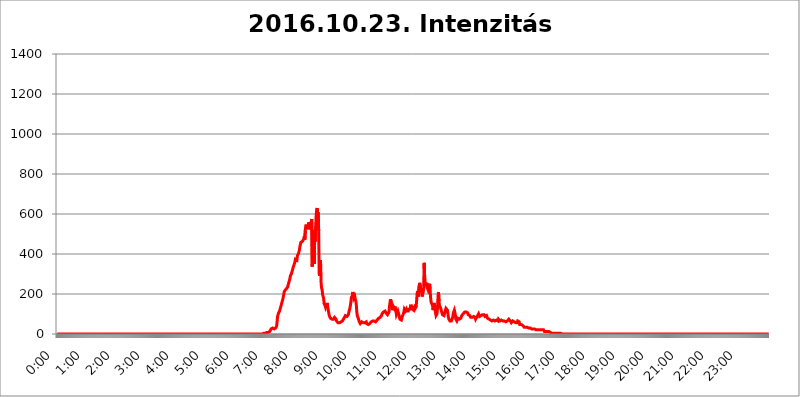
| Category | 2016.10.23. Intenzitás [W/m^2] |
|---|---|
| 0.0 | 0 |
| 0.0006944444444444445 | 0 |
| 0.001388888888888889 | 0 |
| 0.0020833333333333333 | 0 |
| 0.002777777777777778 | 0 |
| 0.003472222222222222 | 0 |
| 0.004166666666666667 | 0 |
| 0.004861111111111111 | 0 |
| 0.005555555555555556 | 0 |
| 0.0062499999999999995 | 0 |
| 0.006944444444444444 | 0 |
| 0.007638888888888889 | 0 |
| 0.008333333333333333 | 0 |
| 0.009027777777777779 | 0 |
| 0.009722222222222222 | 0 |
| 0.010416666666666666 | 0 |
| 0.011111111111111112 | 0 |
| 0.011805555555555555 | 0 |
| 0.012499999999999999 | 0 |
| 0.013194444444444444 | 0 |
| 0.013888888888888888 | 0 |
| 0.014583333333333332 | 0 |
| 0.015277777777777777 | 0 |
| 0.015972222222222224 | 0 |
| 0.016666666666666666 | 0 |
| 0.017361111111111112 | 0 |
| 0.018055555555555557 | 0 |
| 0.01875 | 0 |
| 0.019444444444444445 | 0 |
| 0.02013888888888889 | 0 |
| 0.020833333333333332 | 0 |
| 0.02152777777777778 | 0 |
| 0.022222222222222223 | 0 |
| 0.02291666666666667 | 0 |
| 0.02361111111111111 | 0 |
| 0.024305555555555556 | 0 |
| 0.024999999999999998 | 0 |
| 0.025694444444444447 | 0 |
| 0.02638888888888889 | 0 |
| 0.027083333333333334 | 0 |
| 0.027777777777777776 | 0 |
| 0.02847222222222222 | 0 |
| 0.029166666666666664 | 0 |
| 0.029861111111111113 | 0 |
| 0.030555555555555555 | 0 |
| 0.03125 | 0 |
| 0.03194444444444445 | 0 |
| 0.03263888888888889 | 0 |
| 0.03333333333333333 | 0 |
| 0.034027777777777775 | 0 |
| 0.034722222222222224 | 0 |
| 0.035416666666666666 | 0 |
| 0.036111111111111115 | 0 |
| 0.03680555555555556 | 0 |
| 0.0375 | 0 |
| 0.03819444444444444 | 0 |
| 0.03888888888888889 | 0 |
| 0.03958333333333333 | 0 |
| 0.04027777777777778 | 0 |
| 0.04097222222222222 | 0 |
| 0.041666666666666664 | 0 |
| 0.042361111111111106 | 0 |
| 0.04305555555555556 | 0 |
| 0.043750000000000004 | 0 |
| 0.044444444444444446 | 0 |
| 0.04513888888888889 | 0 |
| 0.04583333333333334 | 0 |
| 0.04652777777777778 | 0 |
| 0.04722222222222222 | 0 |
| 0.04791666666666666 | 0 |
| 0.04861111111111111 | 0 |
| 0.049305555555555554 | 0 |
| 0.049999999999999996 | 0 |
| 0.05069444444444445 | 0 |
| 0.051388888888888894 | 0 |
| 0.052083333333333336 | 0 |
| 0.05277777777777778 | 0 |
| 0.05347222222222222 | 0 |
| 0.05416666666666667 | 0 |
| 0.05486111111111111 | 0 |
| 0.05555555555555555 | 0 |
| 0.05625 | 0 |
| 0.05694444444444444 | 0 |
| 0.057638888888888885 | 0 |
| 0.05833333333333333 | 0 |
| 0.05902777777777778 | 0 |
| 0.059722222222222225 | 0 |
| 0.06041666666666667 | 0 |
| 0.061111111111111116 | 0 |
| 0.06180555555555556 | 0 |
| 0.0625 | 0 |
| 0.06319444444444444 | 0 |
| 0.06388888888888888 | 0 |
| 0.06458333333333334 | 0 |
| 0.06527777777777778 | 0 |
| 0.06597222222222222 | 0 |
| 0.06666666666666667 | 0 |
| 0.06736111111111111 | 0 |
| 0.06805555555555555 | 0 |
| 0.06874999999999999 | 0 |
| 0.06944444444444443 | 0 |
| 0.07013888888888889 | 0 |
| 0.07083333333333333 | 0 |
| 0.07152777777777779 | 0 |
| 0.07222222222222223 | 0 |
| 0.07291666666666667 | 0 |
| 0.07361111111111111 | 0 |
| 0.07430555555555556 | 0 |
| 0.075 | 0 |
| 0.07569444444444444 | 0 |
| 0.0763888888888889 | 0 |
| 0.07708333333333334 | 0 |
| 0.07777777777777778 | 0 |
| 0.07847222222222222 | 0 |
| 0.07916666666666666 | 0 |
| 0.0798611111111111 | 0 |
| 0.08055555555555556 | 0 |
| 0.08125 | 0 |
| 0.08194444444444444 | 0 |
| 0.08263888888888889 | 0 |
| 0.08333333333333333 | 0 |
| 0.08402777777777777 | 0 |
| 0.08472222222222221 | 0 |
| 0.08541666666666665 | 0 |
| 0.08611111111111112 | 0 |
| 0.08680555555555557 | 0 |
| 0.08750000000000001 | 0 |
| 0.08819444444444445 | 0 |
| 0.08888888888888889 | 0 |
| 0.08958333333333333 | 0 |
| 0.09027777777777778 | 0 |
| 0.09097222222222222 | 0 |
| 0.09166666666666667 | 0 |
| 0.09236111111111112 | 0 |
| 0.09305555555555556 | 0 |
| 0.09375 | 0 |
| 0.09444444444444444 | 0 |
| 0.09513888888888888 | 0 |
| 0.09583333333333333 | 0 |
| 0.09652777777777777 | 0 |
| 0.09722222222222222 | 0 |
| 0.09791666666666667 | 0 |
| 0.09861111111111111 | 0 |
| 0.09930555555555555 | 0 |
| 0.09999999999999999 | 0 |
| 0.10069444444444443 | 0 |
| 0.1013888888888889 | 0 |
| 0.10208333333333335 | 0 |
| 0.10277777777777779 | 0 |
| 0.10347222222222223 | 0 |
| 0.10416666666666667 | 0 |
| 0.10486111111111111 | 0 |
| 0.10555555555555556 | 0 |
| 0.10625 | 0 |
| 0.10694444444444444 | 0 |
| 0.1076388888888889 | 0 |
| 0.10833333333333334 | 0 |
| 0.10902777777777778 | 0 |
| 0.10972222222222222 | 0 |
| 0.1111111111111111 | 0 |
| 0.11180555555555556 | 0 |
| 0.11180555555555556 | 0 |
| 0.1125 | 0 |
| 0.11319444444444444 | 0 |
| 0.11388888888888889 | 0 |
| 0.11458333333333333 | 0 |
| 0.11527777777777777 | 0 |
| 0.11597222222222221 | 0 |
| 0.11666666666666665 | 0 |
| 0.1173611111111111 | 0 |
| 0.11805555555555557 | 0 |
| 0.11944444444444445 | 0 |
| 0.12013888888888889 | 0 |
| 0.12083333333333333 | 0 |
| 0.12152777777777778 | 0 |
| 0.12222222222222223 | 0 |
| 0.12291666666666667 | 0 |
| 0.12291666666666667 | 0 |
| 0.12361111111111112 | 0 |
| 0.12430555555555556 | 0 |
| 0.125 | 0 |
| 0.12569444444444444 | 0 |
| 0.12638888888888888 | 0 |
| 0.12708333333333333 | 0 |
| 0.16875 | 0 |
| 0.12847222222222224 | 0 |
| 0.12916666666666668 | 0 |
| 0.12986111111111112 | 0 |
| 0.13055555555555556 | 0 |
| 0.13125 | 0 |
| 0.13194444444444445 | 0 |
| 0.1326388888888889 | 0 |
| 0.13333333333333333 | 0 |
| 0.13402777777777777 | 0 |
| 0.13402777777777777 | 0 |
| 0.13472222222222222 | 0 |
| 0.13541666666666666 | 0 |
| 0.1361111111111111 | 0 |
| 0.13749999999999998 | 0 |
| 0.13819444444444443 | 0 |
| 0.1388888888888889 | 0 |
| 0.13958333333333334 | 0 |
| 0.14027777777777778 | 0 |
| 0.14097222222222222 | 0 |
| 0.14166666666666666 | 0 |
| 0.1423611111111111 | 0 |
| 0.14305555555555557 | 0 |
| 0.14375000000000002 | 0 |
| 0.14444444444444446 | 0 |
| 0.1451388888888889 | 0 |
| 0.1451388888888889 | 0 |
| 0.14652777777777778 | 0 |
| 0.14722222222222223 | 0 |
| 0.14791666666666667 | 0 |
| 0.1486111111111111 | 0 |
| 0.14930555555555555 | 0 |
| 0.15 | 0 |
| 0.15069444444444444 | 0 |
| 0.15138888888888888 | 0 |
| 0.15208333333333332 | 0 |
| 0.15277777777777776 | 0 |
| 0.15347222222222223 | 0 |
| 0.15416666666666667 | 0 |
| 0.15486111111111112 | 0 |
| 0.15555555555555556 | 0 |
| 0.15625 | 0 |
| 0.15694444444444444 | 0 |
| 0.15763888888888888 | 0 |
| 0.15833333333333333 | 0 |
| 0.15902777777777777 | 0 |
| 0.15972222222222224 | 0 |
| 0.16041666666666668 | 0 |
| 0.16111111111111112 | 0 |
| 0.16180555555555556 | 0 |
| 0.1625 | 0 |
| 0.16319444444444445 | 0 |
| 0.1638888888888889 | 0 |
| 0.16458333333333333 | 0 |
| 0.16527777777777777 | 0 |
| 0.16597222222222222 | 0 |
| 0.16666666666666666 | 0 |
| 0.1673611111111111 | 0 |
| 0.16805555555555554 | 0 |
| 0.16874999999999998 | 0 |
| 0.16944444444444443 | 0 |
| 0.17013888888888887 | 0 |
| 0.1708333333333333 | 0 |
| 0.17152777777777775 | 0 |
| 0.17222222222222225 | 0 |
| 0.1729166666666667 | 0 |
| 0.17361111111111113 | 0 |
| 0.17430555555555557 | 0 |
| 0.17500000000000002 | 0 |
| 0.17569444444444446 | 0 |
| 0.1763888888888889 | 0 |
| 0.17708333333333334 | 0 |
| 0.17777777777777778 | 0 |
| 0.17847222222222223 | 0 |
| 0.17916666666666667 | 0 |
| 0.1798611111111111 | 0 |
| 0.18055555555555555 | 0 |
| 0.18125 | 0 |
| 0.18194444444444444 | 0 |
| 0.1826388888888889 | 0 |
| 0.18333333333333335 | 0 |
| 0.1840277777777778 | 0 |
| 0.18472222222222223 | 0 |
| 0.18541666666666667 | 0 |
| 0.18611111111111112 | 0 |
| 0.18680555555555556 | 0 |
| 0.1875 | 0 |
| 0.18819444444444444 | 0 |
| 0.18888888888888888 | 0 |
| 0.18958333333333333 | 0 |
| 0.19027777777777777 | 0 |
| 0.1909722222222222 | 0 |
| 0.19166666666666665 | 0 |
| 0.19236111111111112 | 0 |
| 0.19305555555555554 | 0 |
| 0.19375 | 0 |
| 0.19444444444444445 | 0 |
| 0.1951388888888889 | 0 |
| 0.19583333333333333 | 0 |
| 0.19652777777777777 | 0 |
| 0.19722222222222222 | 0 |
| 0.19791666666666666 | 0 |
| 0.1986111111111111 | 0 |
| 0.19930555555555554 | 0 |
| 0.19999999999999998 | 0 |
| 0.20069444444444443 | 0 |
| 0.20138888888888887 | 0 |
| 0.2020833333333333 | 0 |
| 0.2027777777777778 | 0 |
| 0.2034722222222222 | 0 |
| 0.2041666666666667 | 0 |
| 0.20486111111111113 | 0 |
| 0.20555555555555557 | 0 |
| 0.20625000000000002 | 0 |
| 0.20694444444444446 | 0 |
| 0.2076388888888889 | 0 |
| 0.20833333333333334 | 0 |
| 0.20902777777777778 | 0 |
| 0.20972222222222223 | 0 |
| 0.21041666666666667 | 0 |
| 0.2111111111111111 | 0 |
| 0.21180555555555555 | 0 |
| 0.2125 | 0 |
| 0.21319444444444444 | 0 |
| 0.2138888888888889 | 0 |
| 0.21458333333333335 | 0 |
| 0.2152777777777778 | 0 |
| 0.21597222222222223 | 0 |
| 0.21666666666666667 | 0 |
| 0.21736111111111112 | 0 |
| 0.21805555555555556 | 0 |
| 0.21875 | 0 |
| 0.21944444444444444 | 0 |
| 0.22013888888888888 | 0 |
| 0.22083333333333333 | 0 |
| 0.22152777777777777 | 0 |
| 0.2222222222222222 | 0 |
| 0.22291666666666665 | 0 |
| 0.2236111111111111 | 0 |
| 0.22430555555555556 | 0 |
| 0.225 | 0 |
| 0.22569444444444445 | 0 |
| 0.2263888888888889 | 0 |
| 0.22708333333333333 | 0 |
| 0.22777777777777777 | 0 |
| 0.22847222222222222 | 0 |
| 0.22916666666666666 | 0 |
| 0.2298611111111111 | 0 |
| 0.23055555555555554 | 0 |
| 0.23124999999999998 | 0 |
| 0.23194444444444443 | 0 |
| 0.23263888888888887 | 0 |
| 0.2333333333333333 | 0 |
| 0.2340277777777778 | 0 |
| 0.2347222222222222 | 0 |
| 0.2354166666666667 | 0 |
| 0.23611111111111113 | 0 |
| 0.23680555555555557 | 0 |
| 0.23750000000000002 | 0 |
| 0.23819444444444446 | 0 |
| 0.2388888888888889 | 0 |
| 0.23958333333333334 | 0 |
| 0.24027777777777778 | 0 |
| 0.24097222222222223 | 0 |
| 0.24166666666666667 | 0 |
| 0.2423611111111111 | 0 |
| 0.24305555555555555 | 0 |
| 0.24375 | 0 |
| 0.24444444444444446 | 0 |
| 0.24513888888888888 | 0 |
| 0.24583333333333335 | 0 |
| 0.2465277777777778 | 0 |
| 0.24722222222222223 | 0 |
| 0.24791666666666667 | 0 |
| 0.24861111111111112 | 0 |
| 0.24930555555555556 | 0 |
| 0.25 | 0 |
| 0.25069444444444444 | 0 |
| 0.2513888888888889 | 0 |
| 0.2520833333333333 | 0 |
| 0.25277777777777777 | 0 |
| 0.2534722222222222 | 0 |
| 0.25416666666666665 | 0 |
| 0.2548611111111111 | 0 |
| 0.2555555555555556 | 0 |
| 0.25625000000000003 | 0 |
| 0.2569444444444445 | 0 |
| 0.2576388888888889 | 0 |
| 0.25833333333333336 | 0 |
| 0.2590277777777778 | 0 |
| 0.25972222222222224 | 0 |
| 0.2604166666666667 | 0 |
| 0.2611111111111111 | 0 |
| 0.26180555555555557 | 0 |
| 0.2625 | 0 |
| 0.26319444444444445 | 0 |
| 0.2638888888888889 | 0 |
| 0.26458333333333334 | 0 |
| 0.2652777777777778 | 0 |
| 0.2659722222222222 | 0 |
| 0.26666666666666666 | 0 |
| 0.2673611111111111 | 0 |
| 0.26805555555555555 | 0 |
| 0.26875 | 0 |
| 0.26944444444444443 | 0 |
| 0.2701388888888889 | 0 |
| 0.2708333333333333 | 0 |
| 0.27152777777777776 | 0 |
| 0.2722222222222222 | 0 |
| 0.27291666666666664 | 0 |
| 0.2736111111111111 | 0 |
| 0.2743055555555555 | 0 |
| 0.27499999999999997 | 0 |
| 0.27569444444444446 | 0 |
| 0.27638888888888885 | 0 |
| 0.27708333333333335 | 0 |
| 0.2777777777777778 | 0 |
| 0.27847222222222223 | 0 |
| 0.2791666666666667 | 0 |
| 0.2798611111111111 | 0 |
| 0.28055555555555556 | 0 |
| 0.28125 | 0 |
| 0.28194444444444444 | 0 |
| 0.2826388888888889 | 0 |
| 0.2833333333333333 | 0 |
| 0.28402777777777777 | 0 |
| 0.2847222222222222 | 0 |
| 0.28541666666666665 | 0 |
| 0.28611111111111115 | 0 |
| 0.28680555555555554 | 0 |
| 0.28750000000000003 | 0 |
| 0.2881944444444445 | 0 |
| 0.2888888888888889 | 3.525 |
| 0.28958333333333336 | 3.525 |
| 0.2902777777777778 | 3.525 |
| 0.29097222222222224 | 3.525 |
| 0.2916666666666667 | 3.525 |
| 0.2923611111111111 | 3.525 |
| 0.29305555555555557 | 3.525 |
| 0.29375 | 7.887 |
| 0.29444444444444445 | 7.887 |
| 0.2951388888888889 | 7.887 |
| 0.29583333333333334 | 7.887 |
| 0.2965277777777778 | 7.887 |
| 0.2972222222222222 | 7.887 |
| 0.29791666666666666 | 12.257 |
| 0.2986111111111111 | 12.257 |
| 0.29930555555555555 | 16.636 |
| 0.3 | 25.419 |
| 0.30069444444444443 | 29.823 |
| 0.3013888888888889 | 29.823 |
| 0.3020833333333333 | 29.823 |
| 0.30277777777777776 | 29.823 |
| 0.3034722222222222 | 25.419 |
| 0.30416666666666664 | 25.419 |
| 0.3048611111111111 | 25.419 |
| 0.3055555555555555 | 25.419 |
| 0.30624999999999997 | 29.823 |
| 0.3069444444444444 | 29.823 |
| 0.3076388888888889 | 38.653 |
| 0.30833333333333335 | 60.85 |
| 0.3090277777777778 | 87.692 |
| 0.30972222222222223 | 96.682 |
| 0.3104166666666667 | 105.69 |
| 0.3111111111111111 | 110.201 |
| 0.31180555555555556 | 114.716 |
| 0.3125 | 123.758 |
| 0.31319444444444444 | 132.814 |
| 0.3138888888888889 | 141.884 |
| 0.3145833333333333 | 150.964 |
| 0.31527777777777777 | 160.056 |
| 0.3159722222222222 | 169.156 |
| 0.31666666666666665 | 178.264 |
| 0.31736111111111115 | 191.937 |
| 0.31805555555555554 | 205.62 |
| 0.31875000000000003 | 214.746 |
| 0.3194444444444445 | 219.309 |
| 0.3201388888888889 | 219.309 |
| 0.32083333333333336 | 223.873 |
| 0.3215277777777778 | 228.436 |
| 0.32222222222222224 | 228.436 |
| 0.3229166666666667 | 233 |
| 0.3236111111111111 | 233 |
| 0.32430555555555557 | 251.251 |
| 0.325 | 255.813 |
| 0.32569444444444445 | 269.49 |
| 0.3263888888888889 | 278.603 |
| 0.32708333333333334 | 292.259 |
| 0.3277777777777778 | 296.808 |
| 0.3284722222222222 | 301.354 |
| 0.32916666666666666 | 301.354 |
| 0.3298611111111111 | 319.517 |
| 0.33055555555555555 | 328.584 |
| 0.33125 | 337.639 |
| 0.33194444444444443 | 342.162 |
| 0.3326388888888889 | 351.198 |
| 0.3333333333333333 | 360.221 |
| 0.3340277777777778 | 373.729 |
| 0.3347222222222222 | 378.224 |
| 0.3354166666666667 | 373.729 |
| 0.3361111111111111 | 369.23 |
| 0.3368055555555556 | 391.685 |
| 0.33749999999999997 | 396.164 |
| 0.33819444444444446 | 400.638 |
| 0.33888888888888885 | 409.574 |
| 0.33958333333333335 | 418.492 |
| 0.34027777777777773 | 436.27 |
| 0.34097222222222223 | 440.702 |
| 0.3416666666666666 | 458.38 |
| 0.3423611111111111 | 462.786 |
| 0.3430555555555555 | 462.786 |
| 0.34375 | 462.786 |
| 0.3444444444444445 | 458.38 |
| 0.3451388888888889 | 467.187 |
| 0.3458333333333334 | 475.972 |
| 0.34652777777777777 | 489.108 |
| 0.34722222222222227 | 471.582 |
| 0.34791666666666665 | 519.555 |
| 0.34861111111111115 | 541.121 |
| 0.34930555555555554 | 541.121 |
| 0.35000000000000003 | 545.416 |
| 0.3506944444444444 | 541.121 |
| 0.3513888888888889 | 523.88 |
| 0.3520833333333333 | 545.416 |
| 0.3527777777777778 | 558.261 |
| 0.3534722222222222 | 523.88 |
| 0.3541666666666667 | 532.513 |
| 0.3548611111111111 | 528.2 |
| 0.35555555555555557 | 545.416 |
| 0.35625 | 549.704 |
| 0.35694444444444445 | 575.299 |
| 0.3576388888888889 | 337.639 |
| 0.35833333333333334 | 378.224 |
| 0.3590277777777778 | 484.735 |
| 0.3597222222222222 | 519.555 |
| 0.36041666666666666 | 351.198 |
| 0.3611111111111111 | 506.542 |
| 0.36180555555555555 | 462.786 |
| 0.3625 | 541.121 |
| 0.36319444444444443 | 596.45 |
| 0.3638888888888889 | 621.613 |
| 0.3645833333333333 | 629.948 |
| 0.3652777777777778 | 600.661 |
| 0.3659722222222222 | 609.062 |
| 0.3666666666666667 | 515.223 |
| 0.3673611111111111 | 301.354 |
| 0.3680555555555556 | 292.259 |
| 0.36874999999999997 | 369.23 |
| 0.36944444444444446 | 351.198 |
| 0.37013888888888885 | 251.251 |
| 0.37083333333333335 | 228.436 |
| 0.37152777777777773 | 219.309 |
| 0.37222222222222223 | 196.497 |
| 0.3729166666666666 | 196.497 |
| 0.3736111111111111 | 178.264 |
| 0.3743055555555555 | 150.964 |
| 0.375 | 146.423 |
| 0.3756944444444445 | 141.884 |
| 0.3763888888888889 | 132.814 |
| 0.3770833333333334 | 132.814 |
| 0.37777777777777777 | 146.423 |
| 0.37847222222222227 | 155.509 |
| 0.37916666666666665 | 141.884 |
| 0.37986111111111115 | 123.758 |
| 0.38055555555555554 | 110.201 |
| 0.38125000000000003 | 96.682 |
| 0.3819444444444444 | 87.692 |
| 0.3826388888888889 | 83.205 |
| 0.3833333333333333 | 78.722 |
| 0.3840277777777778 | 74.246 |
| 0.3847222222222222 | 74.246 |
| 0.3854166666666667 | 74.246 |
| 0.3861111111111111 | 74.246 |
| 0.38680555555555557 | 74.246 |
| 0.3875 | 74.246 |
| 0.38819444444444445 | 78.722 |
| 0.3888888888888889 | 83.205 |
| 0.38958333333333334 | 83.205 |
| 0.3902777777777778 | 78.722 |
| 0.3909722222222222 | 74.246 |
| 0.39166666666666666 | 65.31 |
| 0.3923611111111111 | 65.31 |
| 0.39305555555555555 | 65.31 |
| 0.39375 | 56.398 |
| 0.39444444444444443 | 56.398 |
| 0.3951388888888889 | 56.398 |
| 0.3958333333333333 | 56.398 |
| 0.3965277777777778 | 51.951 |
| 0.3972222222222222 | 56.398 |
| 0.3979166666666667 | 60.85 |
| 0.3986111111111111 | 60.85 |
| 0.3993055555555556 | 65.31 |
| 0.39999999999999997 | 65.31 |
| 0.40069444444444446 | 69.775 |
| 0.40138888888888885 | 74.246 |
| 0.40208333333333335 | 78.722 |
| 0.40277777777777773 | 83.205 |
| 0.40347222222222223 | 87.692 |
| 0.4041666666666666 | 92.184 |
| 0.4048611111111111 | 96.682 |
| 0.4055555555555555 | 92.184 |
| 0.40625 | 87.692 |
| 0.4069444444444445 | 92.184 |
| 0.4076388888888889 | 87.692 |
| 0.4083333333333334 | 96.682 |
| 0.40902777777777777 | 110.201 |
| 0.40972222222222227 | 119.235 |
| 0.41041666666666665 | 128.284 |
| 0.41111111111111115 | 141.884 |
| 0.41180555555555554 | 160.056 |
| 0.41250000000000003 | 182.82 |
| 0.4131944444444444 | 182.82 |
| 0.4138888888888889 | 191.937 |
| 0.4145833333333333 | 210.182 |
| 0.4152777777777778 | 196.497 |
| 0.4159722222222222 | 178.264 |
| 0.4166666666666667 | 178.264 |
| 0.4173611111111111 | 187.378 |
| 0.41805555555555557 | 173.709 |
| 0.41875 | 164.605 |
| 0.41944444444444445 | 146.423 |
| 0.4201388888888889 | 110.201 |
| 0.42083333333333334 | 92.184 |
| 0.4215277777777778 | 87.692 |
| 0.4222222222222222 | 78.722 |
| 0.42291666666666666 | 69.775 |
| 0.4236111111111111 | 60.85 |
| 0.42430555555555555 | 60.85 |
| 0.425 | 51.951 |
| 0.42569444444444443 | 47.511 |
| 0.4263888888888889 | 56.398 |
| 0.4270833333333333 | 60.85 |
| 0.4277777777777778 | 60.85 |
| 0.4284722222222222 | 60.85 |
| 0.4291666666666667 | 56.398 |
| 0.4298611111111111 | 56.398 |
| 0.4305555555555556 | 56.398 |
| 0.43124999999999997 | 56.398 |
| 0.43194444444444446 | 56.398 |
| 0.43263888888888885 | 60.85 |
| 0.43333333333333335 | 60.85 |
| 0.43402777777777773 | 51.951 |
| 0.43472222222222223 | 47.511 |
| 0.4354166666666666 | 47.511 |
| 0.4361111111111111 | 47.511 |
| 0.4368055555555555 | 47.511 |
| 0.4375 | 51.951 |
| 0.4381944444444445 | 51.951 |
| 0.4388888888888889 | 56.398 |
| 0.4395833333333334 | 56.398 |
| 0.44027777777777777 | 60.85 |
| 0.44097222222222227 | 60.85 |
| 0.44166666666666665 | 60.85 |
| 0.44236111111111115 | 65.31 |
| 0.44305555555555554 | 65.31 |
| 0.44375000000000003 | 65.31 |
| 0.4444444444444444 | 65.31 |
| 0.4451388888888889 | 60.85 |
| 0.4458333333333333 | 60.85 |
| 0.4465277777777778 | 60.85 |
| 0.4472222222222222 | 65.31 |
| 0.4479166666666667 | 65.31 |
| 0.4486111111111111 | 69.775 |
| 0.44930555555555557 | 69.775 |
| 0.45 | 74.246 |
| 0.45069444444444445 | 78.722 |
| 0.4513888888888889 | 83.205 |
| 0.45208333333333334 | 83.205 |
| 0.4527777777777778 | 83.205 |
| 0.4534722222222222 | 83.205 |
| 0.45416666666666666 | 87.692 |
| 0.4548611111111111 | 92.184 |
| 0.45555555555555555 | 101.184 |
| 0.45625 | 101.184 |
| 0.45694444444444443 | 101.184 |
| 0.4576388888888889 | 110.201 |
| 0.4583333333333333 | 105.69 |
| 0.4590277777777778 | 110.201 |
| 0.4597222222222222 | 114.716 |
| 0.4604166666666667 | 110.201 |
| 0.4611111111111111 | 105.69 |
| 0.4618055555555556 | 101.184 |
| 0.46249999999999997 | 101.184 |
| 0.46319444444444446 | 96.682 |
| 0.46388888888888885 | 96.682 |
| 0.46458333333333335 | 101.184 |
| 0.46527777777777773 | 110.201 |
| 0.46597222222222223 | 137.347 |
| 0.4666666666666666 | 155.509 |
| 0.4673611111111111 | 173.709 |
| 0.4680555555555555 | 169.156 |
| 0.46875 | 155.509 |
| 0.4694444444444445 | 132.814 |
| 0.4701388888888889 | 119.235 |
| 0.4708333333333334 | 123.758 |
| 0.47152777777777777 | 137.347 |
| 0.47222222222222227 | 141.884 |
| 0.47291666666666665 | 128.284 |
| 0.47361111111111115 | 137.347 |
| 0.47430555555555554 | 141.884 |
| 0.47500000000000003 | 114.716 |
| 0.4756944444444444 | 96.682 |
| 0.4763888888888889 | 92.184 |
| 0.4770833333333333 | 101.184 |
| 0.4777777777777778 | 114.716 |
| 0.4784722222222222 | 114.716 |
| 0.4791666666666667 | 96.682 |
| 0.4798611111111111 | 87.692 |
| 0.48055555555555557 | 74.246 |
| 0.48125 | 69.775 |
| 0.48194444444444445 | 69.775 |
| 0.4826388888888889 | 69.775 |
| 0.48333333333333334 | 74.246 |
| 0.4840277777777778 | 87.692 |
| 0.4847222222222222 | 92.184 |
| 0.48541666666666666 | 101.184 |
| 0.4861111111111111 | 110.201 |
| 0.48680555555555555 | 123.758 |
| 0.4875 | 123.758 |
| 0.48819444444444443 | 114.716 |
| 0.4888888888888889 | 119.235 |
| 0.4895833333333333 | 123.758 |
| 0.4902777777777778 | 114.716 |
| 0.4909722222222222 | 114.716 |
| 0.4916666666666667 | 119.235 |
| 0.4923611111111111 | 114.716 |
| 0.4930555555555556 | 123.758 |
| 0.49374999999999997 | 123.758 |
| 0.49444444444444446 | 123.758 |
| 0.49513888888888885 | 128.284 |
| 0.49583333333333335 | 146.423 |
| 0.49652777777777773 | 119.235 |
| 0.49722222222222223 | 114.716 |
| 0.4979166666666666 | 132.814 |
| 0.4986111111111111 | 132.814 |
| 0.4993055555555555 | 123.758 |
| 0.5 | 119.235 |
| 0.5006944444444444 | 132.814 |
| 0.5013888888888889 | 123.758 |
| 0.5020833333333333 | 119.235 |
| 0.5027777777777778 | 128.284 |
| 0.5034722222222222 | 137.347 |
| 0.5041666666666667 | 173.709 |
| 0.5048611111111111 | 205.62 |
| 0.5055555555555555 | 214.746 |
| 0.50625 | 187.378 |
| 0.5069444444444444 | 187.378 |
| 0.5076388888888889 | 242.127 |
| 0.5083333333333333 | 255.813 |
| 0.5090277777777777 | 251.251 |
| 0.5097222222222222 | 228.436 |
| 0.5104166666666666 | 233 |
| 0.5111111111111112 | 205.62 |
| 0.5118055555555555 | 187.378 |
| 0.5125000000000001 | 191.937 |
| 0.5131944444444444 | 191.937 |
| 0.513888888888889 | 228.436 |
| 0.5145833333333333 | 355.712 |
| 0.5152777777777778 | 292.259 |
| 0.5159722222222222 | 260.373 |
| 0.5166666666666667 | 264.932 |
| 0.517361111111111 | 242.127 |
| 0.5180555555555556 | 255.813 |
| 0.5187499999999999 | 233 |
| 0.5194444444444445 | 233 |
| 0.5201388888888888 | 219.309 |
| 0.5208333333333334 | 228.436 |
| 0.5215277777777778 | 223.873 |
| 0.5222222222222223 | 251.251 |
| 0.5229166666666667 | 223.873 |
| 0.5236111111111111 | 182.82 |
| 0.5243055555555556 | 160.056 |
| 0.525 | 160.056 |
| 0.5256944444444445 | 160.056 |
| 0.5263888888888889 | 141.884 |
| 0.5270833333333333 | 119.235 |
| 0.5277777777777778 | 132.814 |
| 0.5284722222222222 | 155.509 |
| 0.5291666666666667 | 141.884 |
| 0.5298611111111111 | 123.758 |
| 0.5305555555555556 | 105.69 |
| 0.53125 | 92.184 |
| 0.5319444444444444 | 92.184 |
| 0.5326388888888889 | 101.184 |
| 0.5333333333333333 | 128.284 |
| 0.5340277777777778 | 191.937 |
| 0.5347222222222222 | 210.182 |
| 0.5354166666666667 | 164.605 |
| 0.5361111111111111 | 141.884 |
| 0.5368055555555555 | 137.347 |
| 0.5375 | 132.814 |
| 0.5381944444444444 | 128.284 |
| 0.5388888888888889 | 114.716 |
| 0.5395833333333333 | 105.69 |
| 0.5402777777777777 | 96.682 |
| 0.5409722222222222 | 92.184 |
| 0.5416666666666666 | 92.184 |
| 0.5423611111111112 | 92.184 |
| 0.5430555555555555 | 92.184 |
| 0.5437500000000001 | 110.201 |
| 0.5444444444444444 | 119.235 |
| 0.545138888888889 | 128.284 |
| 0.5458333333333333 | 123.758 |
| 0.5465277777777778 | 123.758 |
| 0.5472222222222222 | 119.235 |
| 0.5479166666666667 | 101.184 |
| 0.548611111111111 | 83.205 |
| 0.5493055555555556 | 74.246 |
| 0.5499999999999999 | 69.775 |
| 0.5506944444444445 | 65.31 |
| 0.5513888888888888 | 60.85 |
| 0.5520833333333334 | 65.31 |
| 0.5527777777777778 | 65.31 |
| 0.5534722222222223 | 69.775 |
| 0.5541666666666667 | 78.722 |
| 0.5548611111111111 | 87.692 |
| 0.5555555555555556 | 105.69 |
| 0.55625 | 110.201 |
| 0.5569444444444445 | 119.235 |
| 0.5576388888888889 | 119.235 |
| 0.5583333333333333 | 96.682 |
| 0.5590277777777778 | 74.246 |
| 0.5597222222222222 | 69.775 |
| 0.5604166666666667 | 65.31 |
| 0.5611111111111111 | 69.775 |
| 0.5618055555555556 | 78.722 |
| 0.5625 | 83.205 |
| 0.5631944444444444 | 78.722 |
| 0.5638888888888889 | 74.246 |
| 0.5645833333333333 | 69.775 |
| 0.5652777777777778 | 74.246 |
| 0.5659722222222222 | 78.722 |
| 0.5666666666666667 | 83.205 |
| 0.5673611111111111 | 92.184 |
| 0.5680555555555555 | 92.184 |
| 0.56875 | 96.682 |
| 0.5694444444444444 | 101.184 |
| 0.5701388888888889 | 96.682 |
| 0.5708333333333333 | 105.69 |
| 0.5715277777777777 | 110.201 |
| 0.5722222222222222 | 110.201 |
| 0.5729166666666666 | 110.201 |
| 0.5736111111111112 | 110.201 |
| 0.5743055555555555 | 105.69 |
| 0.5750000000000001 | 105.69 |
| 0.5756944444444444 | 105.69 |
| 0.576388888888889 | 96.682 |
| 0.5770833333333333 | 92.184 |
| 0.5777777777777778 | 92.184 |
| 0.5784722222222222 | 92.184 |
| 0.5791666666666667 | 87.692 |
| 0.579861111111111 | 83.205 |
| 0.5805555555555556 | 78.722 |
| 0.5812499999999999 | 78.722 |
| 0.5819444444444445 | 83.205 |
| 0.5826388888888888 | 83.205 |
| 0.5833333333333334 | 83.205 |
| 0.5840277777777778 | 87.692 |
| 0.5847222222222223 | 87.692 |
| 0.5854166666666667 | 83.205 |
| 0.5861111111111111 | 83.205 |
| 0.5868055555555556 | 74.246 |
| 0.5875 | 74.246 |
| 0.5881944444444445 | 83.205 |
| 0.5888888888888889 | 87.692 |
| 0.5895833333333333 | 92.184 |
| 0.5902777777777778 | 96.682 |
| 0.5909722222222222 | 101.184 |
| 0.5916666666666667 | 96.682 |
| 0.5923611111111111 | 87.692 |
| 0.5930555555555556 | 92.184 |
| 0.59375 | 92.184 |
| 0.5944444444444444 | 92.184 |
| 0.5951388888888889 | 92.184 |
| 0.5958333333333333 | 96.682 |
| 0.5965277777777778 | 96.682 |
| 0.5972222222222222 | 101.184 |
| 0.5979166666666667 | 101.184 |
| 0.5986111111111111 | 96.682 |
| 0.5993055555555555 | 92.184 |
| 0.6 | 87.692 |
| 0.6006944444444444 | 83.205 |
| 0.6013888888888889 | 83.205 |
| 0.6020833333333333 | 92.184 |
| 0.6027777777777777 | 87.692 |
| 0.6034722222222222 | 78.722 |
| 0.6041666666666666 | 74.246 |
| 0.6048611111111112 | 74.246 |
| 0.6055555555555555 | 74.246 |
| 0.6062500000000001 | 74.246 |
| 0.6069444444444444 | 74.246 |
| 0.607638888888889 | 69.775 |
| 0.6083333333333333 | 65.31 |
| 0.6090277777777778 | 65.31 |
| 0.6097222222222222 | 65.31 |
| 0.6104166666666667 | 65.31 |
| 0.611111111111111 | 69.775 |
| 0.6118055555555556 | 69.775 |
| 0.6124999999999999 | 65.31 |
| 0.6131944444444445 | 65.31 |
| 0.6138888888888888 | 65.31 |
| 0.6145833333333334 | 65.31 |
| 0.6152777777777778 | 69.775 |
| 0.6159722222222223 | 69.775 |
| 0.6166666666666667 | 69.775 |
| 0.6173611111111111 | 69.775 |
| 0.6180555555555556 | 65.31 |
| 0.61875 | 74.246 |
| 0.6194444444444445 | 74.246 |
| 0.6201388888888889 | 69.775 |
| 0.6208333333333333 | 65.31 |
| 0.6215277777777778 | 65.31 |
| 0.6222222222222222 | 65.31 |
| 0.6229166666666667 | 69.775 |
| 0.6236111111111111 | 74.246 |
| 0.6243055555555556 | 65.31 |
| 0.625 | 65.31 |
| 0.6256944444444444 | 60.85 |
| 0.6263888888888889 | 60.85 |
| 0.6270833333333333 | 65.31 |
| 0.6277777777777778 | 65.31 |
| 0.6284722222222222 | 60.85 |
| 0.6291666666666667 | 60.85 |
| 0.6298611111111111 | 65.31 |
| 0.6305555555555555 | 65.31 |
| 0.63125 | 65.31 |
| 0.6319444444444444 | 60.85 |
| 0.6326388888888889 | 65.31 |
| 0.6333333333333333 | 74.246 |
| 0.6340277777777777 | 69.775 |
| 0.6347222222222222 | 74.246 |
| 0.6354166666666666 | 65.31 |
| 0.6361111111111112 | 60.85 |
| 0.6368055555555555 | 56.398 |
| 0.6375000000000001 | 60.85 |
| 0.6381944444444444 | 60.85 |
| 0.638888888888889 | 65.31 |
| 0.6395833333333333 | 65.31 |
| 0.6402777777777778 | 65.31 |
| 0.6409722222222222 | 60.85 |
| 0.6416666666666667 | 56.398 |
| 0.642361111111111 | 56.398 |
| 0.6430555555555556 | 56.398 |
| 0.6437499999999999 | 56.398 |
| 0.6444444444444445 | 51.951 |
| 0.6451388888888888 | 56.398 |
| 0.6458333333333334 | 65.31 |
| 0.6465277777777778 | 60.85 |
| 0.6472222222222223 | 65.31 |
| 0.6479166666666667 | 60.85 |
| 0.6486111111111111 | 47.511 |
| 0.6493055555555556 | 51.951 |
| 0.65 | 51.951 |
| 0.6506944444444445 | 47.511 |
| 0.6513888888888889 | 47.511 |
| 0.6520833333333333 | 43.079 |
| 0.6527777777777778 | 43.079 |
| 0.6534722222222222 | 38.653 |
| 0.6541666666666667 | 38.653 |
| 0.6548611111111111 | 34.234 |
| 0.6555555555555556 | 34.234 |
| 0.65625 | 34.234 |
| 0.6569444444444444 | 34.234 |
| 0.6576388888888889 | 34.234 |
| 0.6583333333333333 | 34.234 |
| 0.6590277777777778 | 34.234 |
| 0.6597222222222222 | 34.234 |
| 0.6604166666666667 | 34.234 |
| 0.6611111111111111 | 29.823 |
| 0.6618055555555555 | 29.823 |
| 0.6625 | 29.823 |
| 0.6631944444444444 | 29.823 |
| 0.6638888888888889 | 25.419 |
| 0.6645833333333333 | 25.419 |
| 0.6652777777777777 | 25.419 |
| 0.6659722222222222 | 29.823 |
| 0.6666666666666666 | 29.823 |
| 0.6673611111111111 | 25.419 |
| 0.6680555555555556 | 25.419 |
| 0.6687500000000001 | 25.419 |
| 0.6694444444444444 | 25.419 |
| 0.6701388888888888 | 25.419 |
| 0.6708333333333334 | 25.419 |
| 0.6715277777777778 | 21.024 |
| 0.6722222222222222 | 21.024 |
| 0.6729166666666666 | 21.024 |
| 0.6736111111111112 | 21.024 |
| 0.6743055555555556 | 21.024 |
| 0.6749999999999999 | 21.024 |
| 0.6756944444444444 | 21.024 |
| 0.6763888888888889 | 21.024 |
| 0.6770833333333334 | 21.024 |
| 0.6777777777777777 | 21.024 |
| 0.6784722222222223 | 21.024 |
| 0.6791666666666667 | 21.024 |
| 0.6798611111111111 | 21.024 |
| 0.6805555555555555 | 21.024 |
| 0.68125 | 21.024 |
| 0.6819444444444445 | 21.024 |
| 0.6826388888888889 | 16.636 |
| 0.6833333333333332 | 12.257 |
| 0.6840277777777778 | 12.257 |
| 0.6847222222222222 | 12.257 |
| 0.6854166666666667 | 12.257 |
| 0.686111111111111 | 12.257 |
| 0.6868055555555556 | 7.887 |
| 0.6875 | 12.257 |
| 0.6881944444444444 | 12.257 |
| 0.688888888888889 | 12.257 |
| 0.6895833333333333 | 12.257 |
| 0.6902777777777778 | 7.887 |
| 0.6909722222222222 | 7.887 |
| 0.6916666666666668 | 7.887 |
| 0.6923611111111111 | 7.887 |
| 0.6930555555555555 | 7.887 |
| 0.69375 | 3.525 |
| 0.6944444444444445 | 3.525 |
| 0.6951388888888889 | 3.525 |
| 0.6958333333333333 | 3.525 |
| 0.6965277777777777 | 7.887 |
| 0.6972222222222223 | 3.525 |
| 0.6979166666666666 | 3.525 |
| 0.6986111111111111 | 3.525 |
| 0.6993055555555556 | 3.525 |
| 0.7000000000000001 | 3.525 |
| 0.7006944444444444 | 3.525 |
| 0.7013888888888888 | 3.525 |
| 0.7020833333333334 | 3.525 |
| 0.7027777777777778 | 3.525 |
| 0.7034722222222222 | 3.525 |
| 0.7041666666666666 | 3.525 |
| 0.7048611111111112 | 3.525 |
| 0.7055555555555556 | 3.525 |
| 0.7062499999999999 | 3.525 |
| 0.7069444444444444 | 3.525 |
| 0.7076388888888889 | 3.525 |
| 0.7083333333333334 | 0 |
| 0.7090277777777777 | 0 |
| 0.7097222222222223 | 0 |
| 0.7104166666666667 | 0 |
| 0.7111111111111111 | 0 |
| 0.7118055555555555 | 0 |
| 0.7125 | 0 |
| 0.7131944444444445 | 0 |
| 0.7138888888888889 | 0 |
| 0.7145833333333332 | 0 |
| 0.7152777777777778 | 0 |
| 0.7159722222222222 | 0 |
| 0.7166666666666667 | 0 |
| 0.717361111111111 | 0 |
| 0.7180555555555556 | 0 |
| 0.71875 | 0 |
| 0.7194444444444444 | 0 |
| 0.720138888888889 | 0 |
| 0.7208333333333333 | 0 |
| 0.7215277777777778 | 0 |
| 0.7222222222222222 | 0 |
| 0.7229166666666668 | 0 |
| 0.7236111111111111 | 0 |
| 0.7243055555555555 | 0 |
| 0.725 | 0 |
| 0.7256944444444445 | 0 |
| 0.7263888888888889 | 0 |
| 0.7270833333333333 | 0 |
| 0.7277777777777777 | 0 |
| 0.7284722222222223 | 0 |
| 0.7291666666666666 | 0 |
| 0.7298611111111111 | 0 |
| 0.7305555555555556 | 0 |
| 0.7312500000000001 | 0 |
| 0.7319444444444444 | 0 |
| 0.7326388888888888 | 0 |
| 0.7333333333333334 | 0 |
| 0.7340277777777778 | 0 |
| 0.7347222222222222 | 0 |
| 0.7354166666666666 | 0 |
| 0.7361111111111112 | 0 |
| 0.7368055555555556 | 0 |
| 0.7374999999999999 | 0 |
| 0.7381944444444444 | 0 |
| 0.7388888888888889 | 0 |
| 0.7395833333333334 | 0 |
| 0.7402777777777777 | 0 |
| 0.7409722222222223 | 0 |
| 0.7416666666666667 | 0 |
| 0.7423611111111111 | 0 |
| 0.7430555555555555 | 0 |
| 0.74375 | 0 |
| 0.7444444444444445 | 0 |
| 0.7451388888888889 | 0 |
| 0.7458333333333332 | 0 |
| 0.7465277777777778 | 0 |
| 0.7472222222222222 | 0 |
| 0.7479166666666667 | 0 |
| 0.748611111111111 | 0 |
| 0.7493055555555556 | 0 |
| 0.75 | 0 |
| 0.7506944444444444 | 0 |
| 0.751388888888889 | 0 |
| 0.7520833333333333 | 0 |
| 0.7527777777777778 | 0 |
| 0.7534722222222222 | 0 |
| 0.7541666666666668 | 0 |
| 0.7548611111111111 | 0 |
| 0.7555555555555555 | 0 |
| 0.75625 | 0 |
| 0.7569444444444445 | 0 |
| 0.7576388888888889 | 0 |
| 0.7583333333333333 | 0 |
| 0.7590277777777777 | 0 |
| 0.7597222222222223 | 0 |
| 0.7604166666666666 | 0 |
| 0.7611111111111111 | 0 |
| 0.7618055555555556 | 0 |
| 0.7625000000000001 | 0 |
| 0.7631944444444444 | 0 |
| 0.7638888888888888 | 0 |
| 0.7645833333333334 | 0 |
| 0.7652777777777778 | 0 |
| 0.7659722222222222 | 0 |
| 0.7666666666666666 | 0 |
| 0.7673611111111112 | 0 |
| 0.7680555555555556 | 0 |
| 0.7687499999999999 | 0 |
| 0.7694444444444444 | 0 |
| 0.7701388888888889 | 0 |
| 0.7708333333333334 | 0 |
| 0.7715277777777777 | 0 |
| 0.7722222222222223 | 0 |
| 0.7729166666666667 | 0 |
| 0.7736111111111111 | 0 |
| 0.7743055555555555 | 0 |
| 0.775 | 0 |
| 0.7756944444444445 | 0 |
| 0.7763888888888889 | 0 |
| 0.7770833333333332 | 0 |
| 0.7777777777777778 | 0 |
| 0.7784722222222222 | 0 |
| 0.7791666666666667 | 0 |
| 0.779861111111111 | 0 |
| 0.7805555555555556 | 0 |
| 0.78125 | 0 |
| 0.7819444444444444 | 0 |
| 0.782638888888889 | 0 |
| 0.7833333333333333 | 0 |
| 0.7840277777777778 | 0 |
| 0.7847222222222222 | 0 |
| 0.7854166666666668 | 0 |
| 0.7861111111111111 | 0 |
| 0.7868055555555555 | 0 |
| 0.7875 | 0 |
| 0.7881944444444445 | 0 |
| 0.7888888888888889 | 0 |
| 0.7895833333333333 | 0 |
| 0.7902777777777777 | 0 |
| 0.7909722222222223 | 0 |
| 0.7916666666666666 | 0 |
| 0.7923611111111111 | 0 |
| 0.7930555555555556 | 0 |
| 0.7937500000000001 | 0 |
| 0.7944444444444444 | 0 |
| 0.7951388888888888 | 0 |
| 0.7958333333333334 | 0 |
| 0.7965277777777778 | 0 |
| 0.7972222222222222 | 0 |
| 0.7979166666666666 | 0 |
| 0.7986111111111112 | 0 |
| 0.7993055555555556 | 0 |
| 0.7999999999999999 | 0 |
| 0.8006944444444444 | 0 |
| 0.8013888888888889 | 0 |
| 0.8020833333333334 | 0 |
| 0.8027777777777777 | 0 |
| 0.8034722222222223 | 0 |
| 0.8041666666666667 | 0 |
| 0.8048611111111111 | 0 |
| 0.8055555555555555 | 0 |
| 0.80625 | 0 |
| 0.8069444444444445 | 0 |
| 0.8076388888888889 | 0 |
| 0.8083333333333332 | 0 |
| 0.8090277777777778 | 0 |
| 0.8097222222222222 | 0 |
| 0.8104166666666667 | 0 |
| 0.811111111111111 | 0 |
| 0.8118055555555556 | 0 |
| 0.8125 | 0 |
| 0.8131944444444444 | 0 |
| 0.813888888888889 | 0 |
| 0.8145833333333333 | 0 |
| 0.8152777777777778 | 0 |
| 0.8159722222222222 | 0 |
| 0.8166666666666668 | 0 |
| 0.8173611111111111 | 0 |
| 0.8180555555555555 | 0 |
| 0.81875 | 0 |
| 0.8194444444444445 | 0 |
| 0.8201388888888889 | 0 |
| 0.8208333333333333 | 0 |
| 0.8215277777777777 | 0 |
| 0.8222222222222223 | 0 |
| 0.8229166666666666 | 0 |
| 0.8236111111111111 | 0 |
| 0.8243055555555556 | 0 |
| 0.8250000000000001 | 0 |
| 0.8256944444444444 | 0 |
| 0.8263888888888888 | 0 |
| 0.8270833333333334 | 0 |
| 0.8277777777777778 | 0 |
| 0.8284722222222222 | 0 |
| 0.8291666666666666 | 0 |
| 0.8298611111111112 | 0 |
| 0.8305555555555556 | 0 |
| 0.8312499999999999 | 0 |
| 0.8319444444444444 | 0 |
| 0.8326388888888889 | 0 |
| 0.8333333333333334 | 0 |
| 0.8340277777777777 | 0 |
| 0.8347222222222223 | 0 |
| 0.8354166666666667 | 0 |
| 0.8361111111111111 | 0 |
| 0.8368055555555555 | 0 |
| 0.8375 | 0 |
| 0.8381944444444445 | 0 |
| 0.8388888888888889 | 0 |
| 0.8395833333333332 | 0 |
| 0.8402777777777778 | 0 |
| 0.8409722222222222 | 0 |
| 0.8416666666666667 | 0 |
| 0.842361111111111 | 0 |
| 0.8430555555555556 | 0 |
| 0.84375 | 0 |
| 0.8444444444444444 | 0 |
| 0.845138888888889 | 0 |
| 0.8458333333333333 | 0 |
| 0.8465277777777778 | 0 |
| 0.8472222222222222 | 0 |
| 0.8479166666666668 | 0 |
| 0.8486111111111111 | 0 |
| 0.8493055555555555 | 0 |
| 0.85 | 0 |
| 0.8506944444444445 | 0 |
| 0.8513888888888889 | 0 |
| 0.8520833333333333 | 0 |
| 0.8527777777777777 | 0 |
| 0.8534722222222223 | 0 |
| 0.8541666666666666 | 0 |
| 0.8548611111111111 | 0 |
| 0.8555555555555556 | 0 |
| 0.8562500000000001 | 0 |
| 0.8569444444444444 | 0 |
| 0.8576388888888888 | 0 |
| 0.8583333333333334 | 0 |
| 0.8590277777777778 | 0 |
| 0.8597222222222222 | 0 |
| 0.8604166666666666 | 0 |
| 0.8611111111111112 | 0 |
| 0.8618055555555556 | 0 |
| 0.8624999999999999 | 0 |
| 0.8631944444444444 | 0 |
| 0.8638888888888889 | 0 |
| 0.8645833333333334 | 0 |
| 0.8652777777777777 | 0 |
| 0.8659722222222223 | 0 |
| 0.8666666666666667 | 0 |
| 0.8673611111111111 | 0 |
| 0.8680555555555555 | 0 |
| 0.86875 | 0 |
| 0.8694444444444445 | 0 |
| 0.8701388888888889 | 0 |
| 0.8708333333333332 | 0 |
| 0.8715277777777778 | 0 |
| 0.8722222222222222 | 0 |
| 0.8729166666666667 | 0 |
| 0.873611111111111 | 0 |
| 0.8743055555555556 | 0 |
| 0.875 | 0 |
| 0.8756944444444444 | 0 |
| 0.876388888888889 | 0 |
| 0.8770833333333333 | 0 |
| 0.8777777777777778 | 0 |
| 0.8784722222222222 | 0 |
| 0.8791666666666668 | 0 |
| 0.8798611111111111 | 0 |
| 0.8805555555555555 | 0 |
| 0.88125 | 0 |
| 0.8819444444444445 | 0 |
| 0.8826388888888889 | 0 |
| 0.8833333333333333 | 0 |
| 0.8840277777777777 | 0 |
| 0.8847222222222223 | 0 |
| 0.8854166666666666 | 0 |
| 0.8861111111111111 | 0 |
| 0.8868055555555556 | 0 |
| 0.8875000000000001 | 0 |
| 0.8881944444444444 | 0 |
| 0.8888888888888888 | 0 |
| 0.8895833333333334 | 0 |
| 0.8902777777777778 | 0 |
| 0.8909722222222222 | 0 |
| 0.8916666666666666 | 0 |
| 0.8923611111111112 | 0 |
| 0.8930555555555556 | 0 |
| 0.8937499999999999 | 0 |
| 0.8944444444444444 | 0 |
| 0.8951388888888889 | 0 |
| 0.8958333333333334 | 0 |
| 0.8965277777777777 | 0 |
| 0.8972222222222223 | 0 |
| 0.8979166666666667 | 0 |
| 0.8986111111111111 | 0 |
| 0.8993055555555555 | 0 |
| 0.9 | 0 |
| 0.9006944444444445 | 0 |
| 0.9013888888888889 | 0 |
| 0.9020833333333332 | 0 |
| 0.9027777777777778 | 0 |
| 0.9034722222222222 | 0 |
| 0.9041666666666667 | 0 |
| 0.904861111111111 | 0 |
| 0.9055555555555556 | 0 |
| 0.90625 | 0 |
| 0.9069444444444444 | 0 |
| 0.907638888888889 | 0 |
| 0.9083333333333333 | 0 |
| 0.9090277777777778 | 0 |
| 0.9097222222222222 | 0 |
| 0.9104166666666668 | 0 |
| 0.9111111111111111 | 0 |
| 0.9118055555555555 | 0 |
| 0.9125 | 0 |
| 0.9131944444444445 | 0 |
| 0.9138888888888889 | 0 |
| 0.9145833333333333 | 0 |
| 0.9152777777777777 | 0 |
| 0.9159722222222223 | 0 |
| 0.9166666666666666 | 0 |
| 0.9173611111111111 | 0 |
| 0.9180555555555556 | 0 |
| 0.9187500000000001 | 0 |
| 0.9194444444444444 | 0 |
| 0.9201388888888888 | 0 |
| 0.9208333333333334 | 0 |
| 0.9215277777777778 | 0 |
| 0.9222222222222222 | 0 |
| 0.9229166666666666 | 0 |
| 0.9236111111111112 | 0 |
| 0.9243055555555556 | 0 |
| 0.9249999999999999 | 0 |
| 0.9256944444444444 | 0 |
| 0.9263888888888889 | 0 |
| 0.9270833333333334 | 0 |
| 0.9277777777777777 | 0 |
| 0.9284722222222223 | 0 |
| 0.9291666666666667 | 0 |
| 0.9298611111111111 | 0 |
| 0.9305555555555555 | 0 |
| 0.93125 | 0 |
| 0.9319444444444445 | 0 |
| 0.9326388888888889 | 0 |
| 0.9333333333333332 | 0 |
| 0.9340277777777778 | 0 |
| 0.9347222222222222 | 0 |
| 0.9354166666666667 | 0 |
| 0.936111111111111 | 0 |
| 0.9368055555555556 | 0 |
| 0.9375 | 0 |
| 0.9381944444444444 | 0 |
| 0.938888888888889 | 0 |
| 0.9395833333333333 | 0 |
| 0.9402777777777778 | 0 |
| 0.9409722222222222 | 0 |
| 0.9416666666666668 | 0 |
| 0.9423611111111111 | 0 |
| 0.9430555555555555 | 0 |
| 0.94375 | 0 |
| 0.9444444444444445 | 0 |
| 0.9451388888888889 | 0 |
| 0.9458333333333333 | 0 |
| 0.9465277777777777 | 0 |
| 0.9472222222222223 | 0 |
| 0.9479166666666666 | 0 |
| 0.9486111111111111 | 0 |
| 0.9493055555555556 | 0 |
| 0.9500000000000001 | 0 |
| 0.9506944444444444 | 0 |
| 0.9513888888888888 | 0 |
| 0.9520833333333334 | 0 |
| 0.9527777777777778 | 0 |
| 0.9534722222222222 | 0 |
| 0.9541666666666666 | 0 |
| 0.9548611111111112 | 0 |
| 0.9555555555555556 | 0 |
| 0.9562499999999999 | 0 |
| 0.9569444444444444 | 0 |
| 0.9576388888888889 | 0 |
| 0.9583333333333334 | 0 |
| 0.9590277777777777 | 0 |
| 0.9597222222222223 | 0 |
| 0.9604166666666667 | 0 |
| 0.9611111111111111 | 0 |
| 0.9618055555555555 | 0 |
| 0.9625 | 0 |
| 0.9631944444444445 | 0 |
| 0.9638888888888889 | 0 |
| 0.9645833333333332 | 0 |
| 0.9652777777777778 | 0 |
| 0.9659722222222222 | 0 |
| 0.9666666666666667 | 0 |
| 0.967361111111111 | 0 |
| 0.9680555555555556 | 0 |
| 0.96875 | 0 |
| 0.9694444444444444 | 0 |
| 0.970138888888889 | 0 |
| 0.9708333333333333 | 0 |
| 0.9715277777777778 | 0 |
| 0.9722222222222222 | 0 |
| 0.9729166666666668 | 0 |
| 0.9736111111111111 | 0 |
| 0.9743055555555555 | 0 |
| 0.975 | 0 |
| 0.9756944444444445 | 0 |
| 0.9763888888888889 | 0 |
| 0.9770833333333333 | 0 |
| 0.9777777777777777 | 0 |
| 0.9784722222222223 | 0 |
| 0.9791666666666666 | 0 |
| 0.9798611111111111 | 0 |
| 0.9805555555555556 | 0 |
| 0.9812500000000001 | 0 |
| 0.9819444444444444 | 0 |
| 0.9826388888888888 | 0 |
| 0.9833333333333334 | 0 |
| 0.9840277777777778 | 0 |
| 0.9847222222222222 | 0 |
| 0.9854166666666666 | 0 |
| 0.9861111111111112 | 0 |
| 0.9868055555555556 | 0 |
| 0.9874999999999999 | 0 |
| 0.9881944444444444 | 0 |
| 0.9888888888888889 | 0 |
| 0.9895833333333334 | 0 |
| 0.9902777777777777 | 0 |
| 0.9909722222222223 | 0 |
| 0.9916666666666667 | 0 |
| 0.9923611111111111 | 0 |
| 0.9930555555555555 | 0 |
| 0.99375 | 0 |
| 0.9944444444444445 | 0 |
| 0.9951388888888889 | 0 |
| 0.9958333333333332 | 0 |
| 0.9965277777777778 | 0 |
| 0.9972222222222222 | 0 |
| 0.9979166666666667 | 0 |
| 0.998611111111111 | 0 |
| 0.9993055555555556 | 0 |